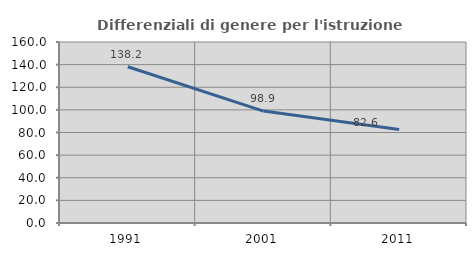
| Category | Differenziali di genere per l'istruzione superiore |
|---|---|
| 1991.0 | 138.158 |
| 2001.0 | 98.918 |
| 2011.0 | 82.609 |